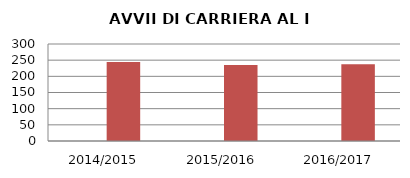
| Category | ANNO | NUMERO |
|---|---|---|
| 2014/2015 | 0 | 244 |
| 2015/2016 | 0 | 235 |
| 2016/2017 | 0 | 237 |